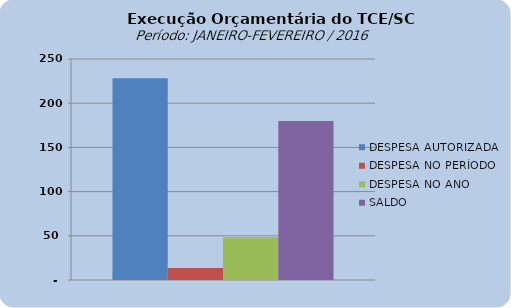
| Category | DESPESA AUTORIZADA | DESPESA NO PERÍODO | DESPESA NO ANO | SALDO |
|---|---|---|---|---|
| 0 | 228251880.27 | 13590798.19 | 48496910.74 | 179754969.53 |